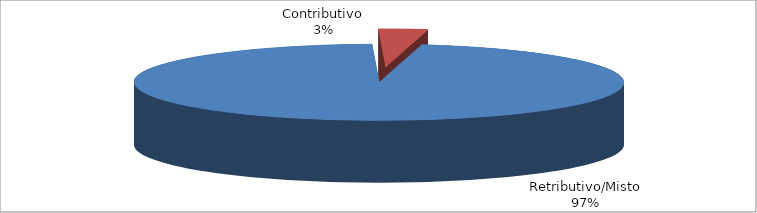
| Category | Series 1 |
|---|---|
| Retributivo/Misto | 28118 |
| Contributivo | 941 |